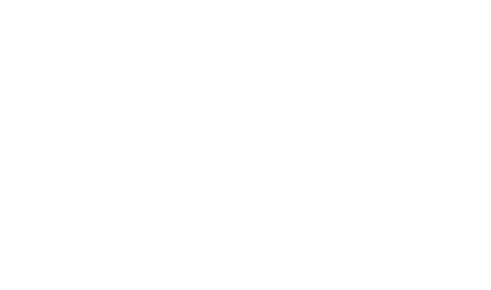
| Category | Series 0 |
|---|---|
| 0 | 94.915 |
| 1 | 27.562 |
| 2 | 20.548 |
| 3 | 6.758 |
| 4 | 4.664 |
| 5 | 4.574 |
| 6 | 0.783 |
| 7 | 6.524 |